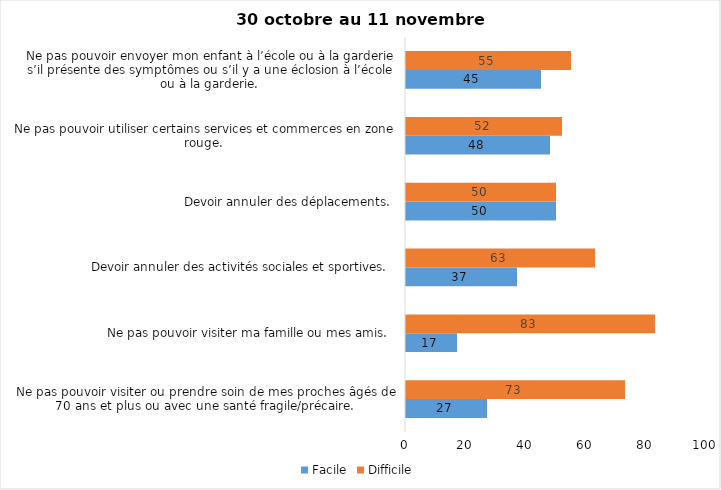
| Category | Facile | Difficile |
|---|---|---|
| Ne pas pouvoir visiter ou prendre soin de mes proches âgés de 70 ans et plus ou avec une santé fragile/précaire.  | 27 | 73 |
| Ne pas pouvoir visiter ma famille ou mes amis.  | 17 | 83 |
| Devoir annuler des activités sociales et sportives.  | 37 | 63 |
| Devoir annuler des déplacements.  | 50 | 50 |
| Ne pas pouvoir utiliser certains services et commerces en zone rouge.  | 48 | 52 |
| Ne pas pouvoir envoyer mon enfant à l’école ou à la garderie s’il présente des symptômes ou s’il y a une éclosion à l’école ou à la garderie.  | 45 | 55 |